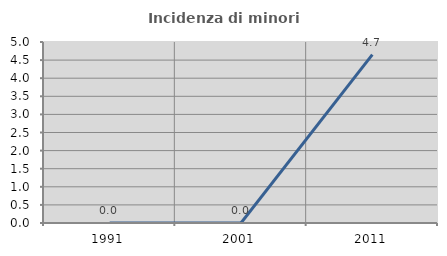
| Category | Incidenza di minori stranieri |
|---|---|
| 1991.0 | 0 |
| 2001.0 | 0 |
| 2011.0 | 4.651 |